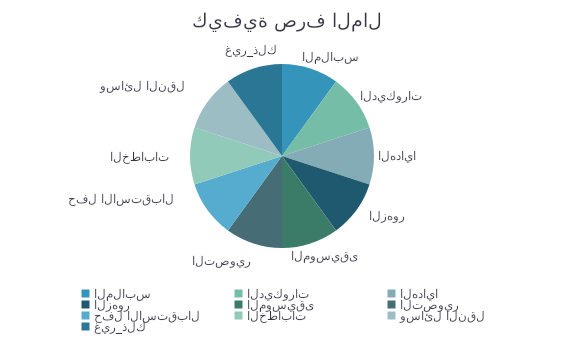
| Category | المبلغ |
|---|---|
| الملابس | 1 |
| الديكورات | 1 |
| الهدايا | 1 |
| الزهور | 1 |
| الموسيقى | 1 |
| التصوير | 1 |
| حفل الاستقبال | 1 |
| الخطابات | 1 |
| وسائل النقل | 1 |
| غير_ذلك | 1 |